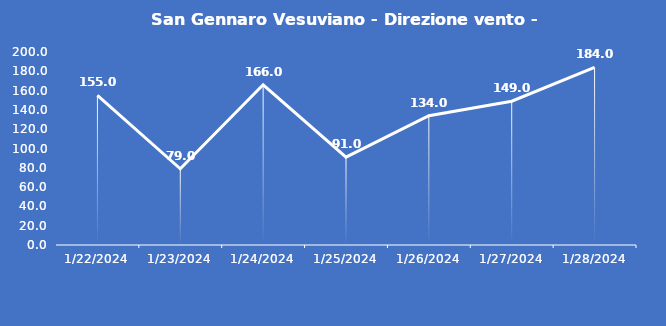
| Category | San Gennaro Vesuviano - Direzione vento - Grezzo (°N) |
|---|---|
| 1/22/24 | 155 |
| 1/23/24 | 79 |
| 1/24/24 | 166 |
| 1/25/24 | 91 |
| 1/26/24 | 134 |
| 1/27/24 | 149 |
| 1/28/24 | 184 |